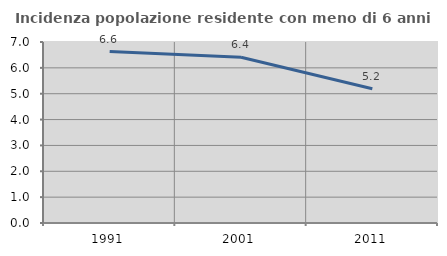
| Category | Incidenza popolazione residente con meno di 6 anni |
|---|---|
| 1991.0 | 6.632 |
| 2001.0 | 6.408 |
| 2011.0 | 5.192 |